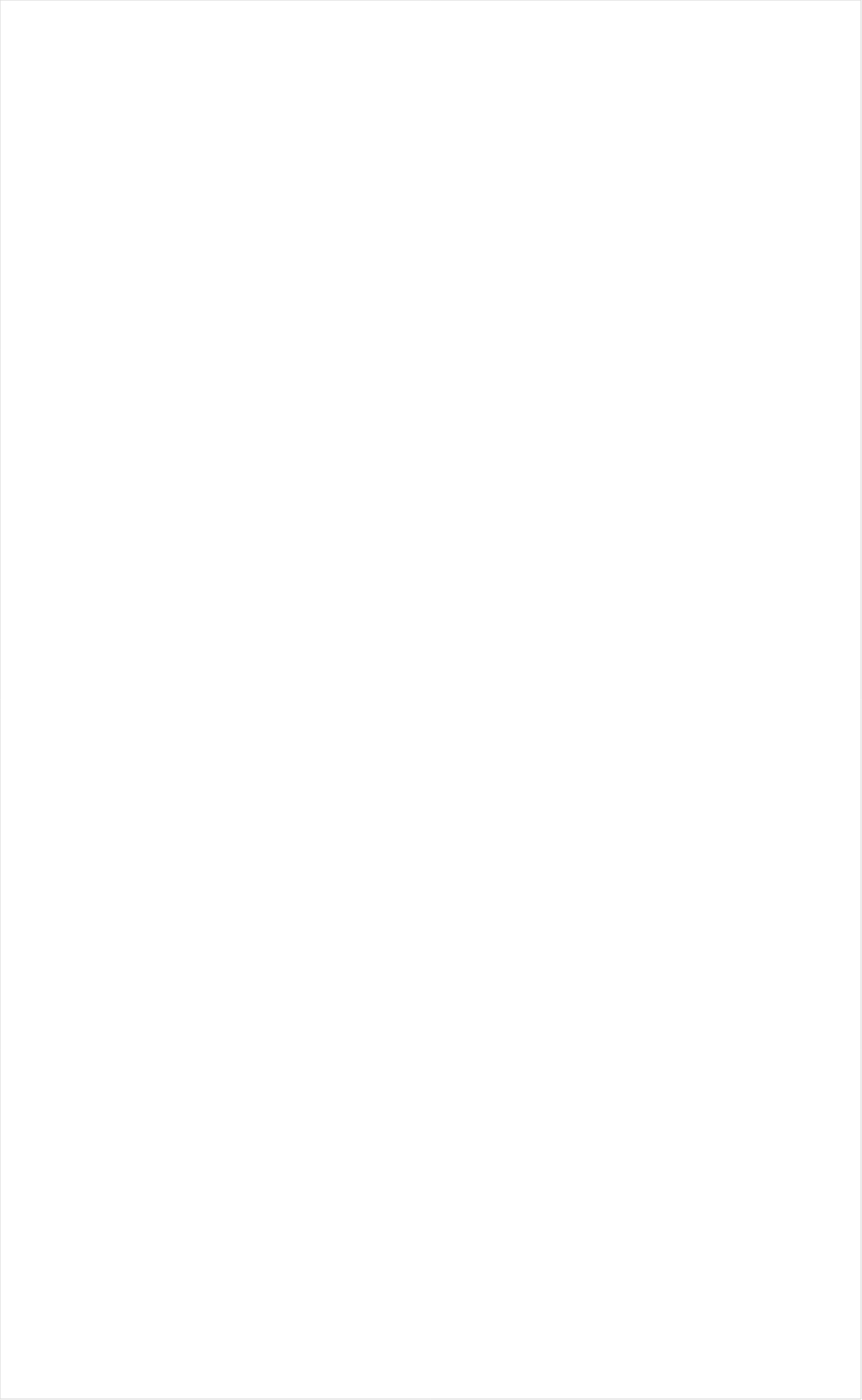
| Category | Total |
|---|---|
| RFD TV | -0.284 |
| Fox Business | -0.208 |
| Hallmark Movies & Mysteries | -0.189 |
| MyNetworkTV | -0.18 |
| PBS | -0.18 |
| MSNBC | -0.176 |
| CBS Sports | -0.141 |
| INSP | -0.141 |
| Fox News | -0.14 |
| Smithsonian | -0.134 |
| Science Channel | -0.123 |
| Hallmark | -0.123 |
| Tennis Channel | -0.121 |
| CBS | -0.119 |
| Reelz Channel | -0.114 |
| Logo | -0.11 |
| American Heroes Channel | -0.105 |
| National Geographic Wild | -0.104 |
| DIY | -0.103 |
| Bloomberg HD | -0.101 |
| SundanceTV | -0.099 |
| History Channel | -0.099 |
| CNN | -0.098 |
| Great American Country | -0.094 |
| Weather Channel | -0.091 |
| ESPNU | -0.091 |
| NBC | -0.089 |
| Outdoor Channel | -0.084 |
| Golf | -0.08 |
| Destination America | -0.077 |
| FYI | -0.07 |
| TV LAND | -0.068 |
| Game Show | -0.068 |
| WGN America | -0.067 |
| HGTV | -0.067 |
| Ovation | -0.064 |
| ABC | -0.064 |
| CMTV | -0.061 |
| Headline News | -0.061 |
| Cooking Channel | -0.058 |
| Animal Planet | -0.056 |
| BBC America | -0.053 |
| ION | -0.05 |
| NBC Sports | -0.05 |
| Motor Trend Network | -0.049 |
| Investigation Discovery | -0.048 |
| Big Ten Network | -0.048 |
| Oprah Winfrey Network | -0.047 |
| POP | -0.046 |
| MLB Network | -0.043 |
| NHL | -0.042 |
| AMC | -0.041 |
| Discovery Channel | -0.041 |
| Travel | -0.041 |
| FOX Sports 2 | -0.04 |
| CW | -0.036 |
| National Geographic | -0.033 |
| FOX | -0.032 |
| Independent Film (IFC) | -0.029 |
| Discovery Family Channel | -0.029 |
| PAC-12 Network | -0.025 |
| UP TV | -0.024 |
| The Sportsman Channel | -0.023 |
| Olympic Channel | -0.018 |
| OXYGEN | -0.017 |
| Viceland | -0.012 |
| Food Network | -0.008 |
| TBS | 0 |
| WE TV | 0 |
| A&E | 0.002 |
| Paramount Network | 0.004 |
| Fox Sports 1 | 0.007 |
| FX Movie Channel | 0.008 |
| TLC | 0.017 |
| Lifetime | 0.023 |
| TNT | 0.025 |
| BRAVO | 0.025 |
| NFL Network | 0.029 |
| ESPNEWS | 0.03 |
| SYFY | 0.031 |
| CNBC | 0.036 |
| FXDEP | 0.037 |
| Lifetime Movies | 0.041 |
| TV ONE | 0.046 |
| BET Her | 0.054 |
| USA Network | 0.056 |
| ESPN2 | 0.064 |
| NBA TV | 0.071 |
| Freeform | 0.076 |
| E! | 0.077 |
| ESPN | 0.079 |
| FX | 0.083 |
| Comedy Central | 0.085 |
| FXX | 0.088 |
| Discovery Life Channel | 0.097 |
| truTV | 0.105 |
| BET | 0.128 |
| ESPN Deportes | 0.134 |
| Universal Kids | 0.138 |
| Disney XD | 0.139 |
| Nick@Nite | 0.141 |
| Disney Channel | 0.15 |
| NBC Universo | 0.174 |
| Nick Toons | 0.178 |
| MTV | 0.184 |
| VH1 | 0.194 |
| TUDN | 0.2 |
| Telemundo | 0.205 |
| Teen Nick | 0.208 |
| UniMas | 0.209 |
| Cartoon Network | 0.219 |
| Univision | 0.219 |
| Adult Swim | 0.221 |
| Nick | 0.231 |
| MTV2 | 0.236 |
| Galavision | 0.236 |
| Nick Jr. | 0.321 |
| Disney Junior US | 0.339 |